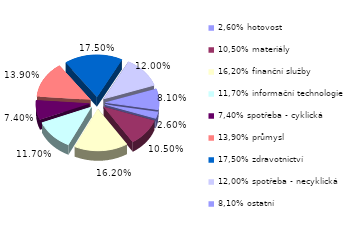
| Category | Series 0 |
|---|---|
| 2,60% hotovost | 0.026 |
| 10,50% materiály | 0.105 |
| 16,20% finanční služby | 0.162 |
| 11,70% informační technologie | 0.117 |
| 7,40% spotřeba - cyklická | 0.074 |
| 13,90% průmysl | 0.139 |
| 17,50% zdravotnictví | 0.175 |
| 12,00% spotřeba - necyklická | 0.12 |
| 8,10% ostatní | 0.081 |